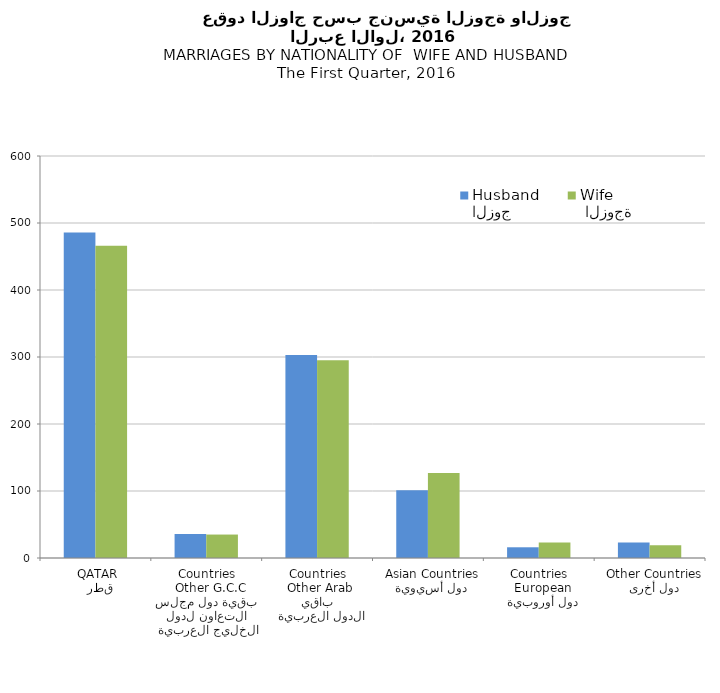
| Category | الزوج
Husband |  الزوجة
Wife |
|---|---|---|
|   قطر
 QATAR | 486 | 466 |
|  بقية دول مجلس التعاون لدول الخليج العربية
  Other G.C.C Countries | 36 | 35 |
|   باقي الدول العربية
 Other Arab Countries | 303 | 295 |
|   دول أسيوية
  Asian Countries | 101 | 127 |
|   دول أوروبية
  European Countries | 16 | 23 |
|   دول أخرى
  Other Countries | 23 | 19 |